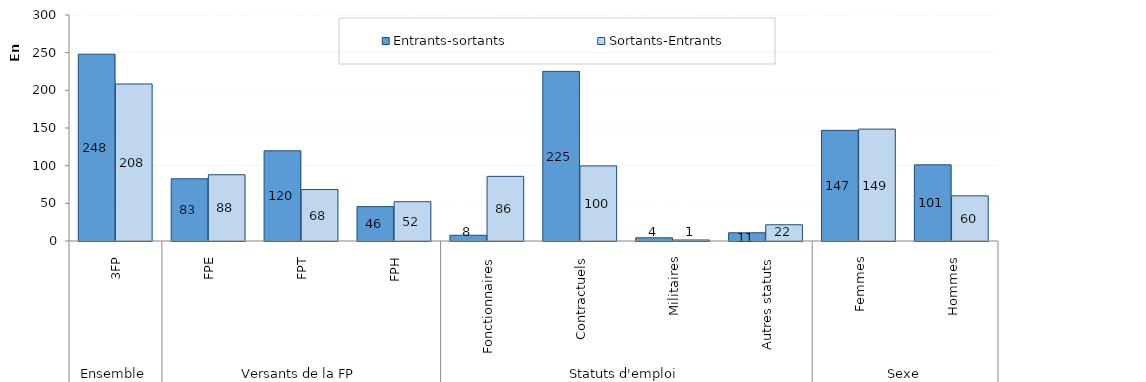
| Category | Entrants-sortants | Sortants-Entrants |
|---|---|---|
| 0 | 247966 | 208424 |
| 1 | 82604 | 87957 |
| 2 | 119731 | 68321 |
| 3 | 45631 | 52146 |
| 4 | 7625 | 85819 |
| 5 | 225130 | 99670 |
| 6 | 4271 | 1368 |
| 7 | 10940 | 21567 |
| 8 | 146866 | 148516 |
| 9 | 101100 | 59908 |